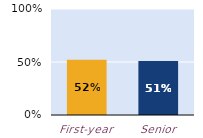
| Category | substantially |
|---|---|
| First-year | 0.522 |
| Senior | 0.509 |